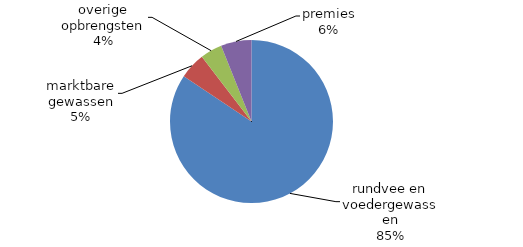
| Category | 2018* |
|---|---|
| rundvee en voedergewassen | 261077.93 |
| marktbare gewassen | 16082.083 |
| overige opbrengsten | 13441.514 |
| premies | 18797.217 |